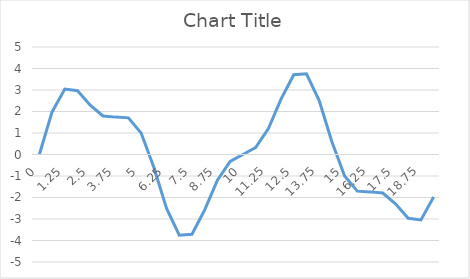
| Category | Series 0 |
|---|---|
| 0.0 | 0 |
| 0.625 | 1.98 |
| 1.25 | 3.045 |
| 1.875 | 2.967 |
| 2.5 | 2.293 |
| 3.125 | 1.791 |
| 3.75 | 1.739 |
| 4.375 | 1.704 |
| 5.0 | 1 |
| 5.625 | -0.592 |
| 6.25 | -2.504 |
| 6.875 | -3.752 |
| 7.5 | -3.707 |
| 8.125 | -2.577 |
| 8.75 | -1.197 |
| 9.375 | -0.317 |
| 10.0 | 0 |
| 10.625 | 0.317 |
| 11.25 | 1.197 |
| 11.875 | 2.577 |
| 12.5 | 3.707 |
| 13.125 | 3.752 |
| 13.75 | 2.504 |
| 14.375 | 0.592 |
| 15.0 | -1 |
| 15.625 | -1.704 |
| 16.25 | -1.739 |
| 16.875 | -1.791 |
| 17.5 | -2.293 |
| 18.125 | -2.967 |
| 18.75 | -3.045 |
| 19.375 | -1.98 |